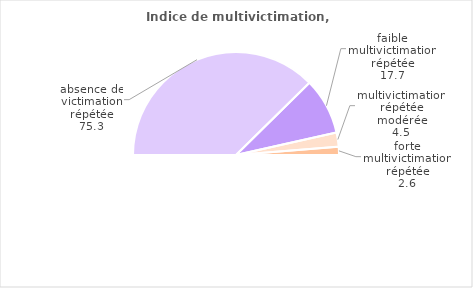
| Category | Series 0 |
|---|---|
| absence de victimation répétée | 75.27 |
| faible multivictimation répétée | 17.7 |
| multivictimation répétée modérée | 4.459 |
| forte multivictimation répétée | 2.571 |
| Total | 100 |